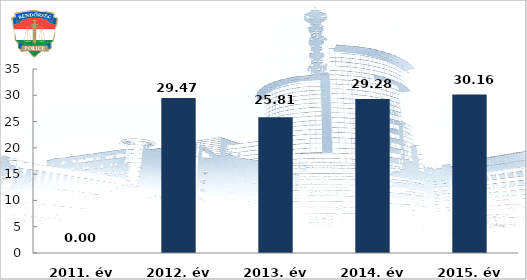
| Category | Tulajdon elleni szabálysértési ügyek felderítési mutatója (%) |
|---|---|
| 2011. év | 0 |
| 2012. év | 29.47 |
| 2013. év | 25.81 |
| 2014. év | 29.28 |
| 2015. év | 30.16 |